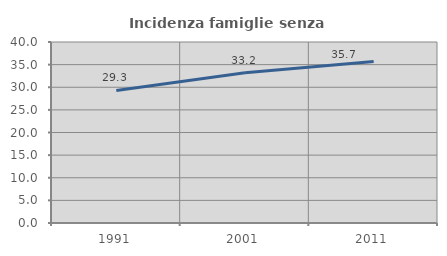
| Category | Incidenza famiglie senza nuclei |
|---|---|
| 1991.0 | 29.289 |
| 2001.0 | 33.214 |
| 2011.0 | 35.714 |